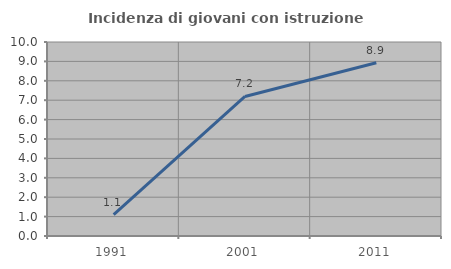
| Category | Incidenza di giovani con istruzione universitaria |
|---|---|
| 1991.0 | 1.099 |
| 2001.0 | 7.194 |
| 2011.0 | 8.929 |